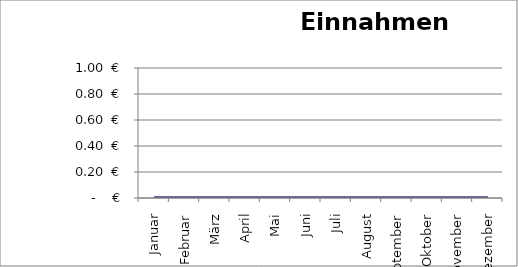
| Category | Einnahmen |
|---|---|
| Januar | 0 |
| Februar | 0 |
| März | 0 |
| April | 0 |
| Mai | 0 |
| Juni | 0 |
| Juli | 0 |
| August | 0 |
| September | 0 |
| Oktober | 0 |
| November | 0 |
| Dezember | 0 |